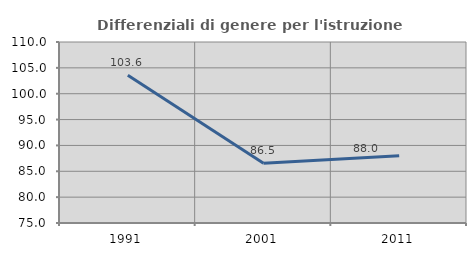
| Category | Differenziali di genere per l'istruzione superiore |
|---|---|
| 1991.0 | 103.585 |
| 2001.0 | 86.547 |
| 2011.0 | 88.024 |